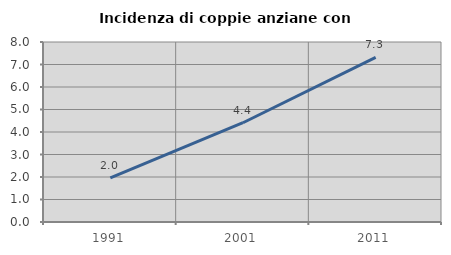
| Category | Incidenza di coppie anziane con figli |
|---|---|
| 1991.0 | 1.956 |
| 2001.0 | 4.412 |
| 2011.0 | 7.317 |